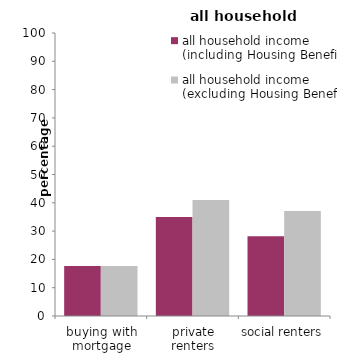
| Category | all household income 
(including Housing Benefit) | all household income 
(excluding Housing Benefit) |
|---|---|---|
| buying with mortgage | 17.661 | 17.661 |
| private renters | 35.002 | 40.971 |
| social renters | 28.186 | 37.118 |